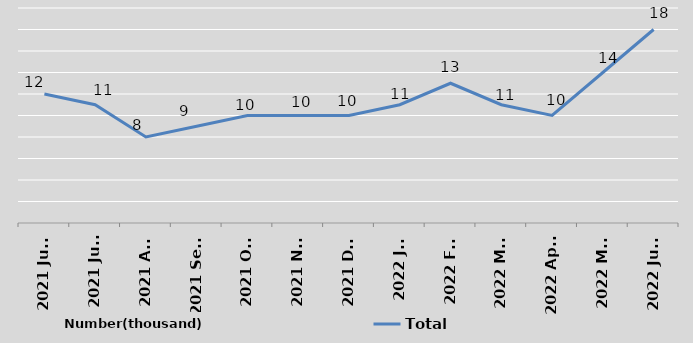
| Category | Total |
|---|---|
| 2021 June | 12 |
| 2021 July | 11 |
| 2021 Aug | 8 |
| 2021 Sept | 9 |
| 2021 Oct | 10 |
| 2021 Nov | 10 |
| 2021 Dec | 10 |
| 2022 Jan | 11 |
| 2022 Feb | 13 |
| 2022 Mar | 11 |
| 2022 April | 10 |
| 2022 May | 14 |
| 2022 June | 18 |